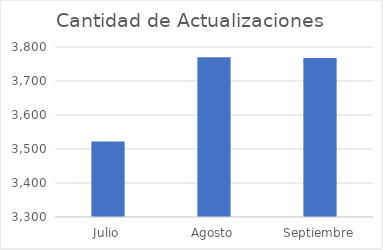
| Category | Cantidad de Actualizaciones |
|---|---|
| Julio | 3522 |
| Agosto | 3770 |
| Septiembre | 3768 |